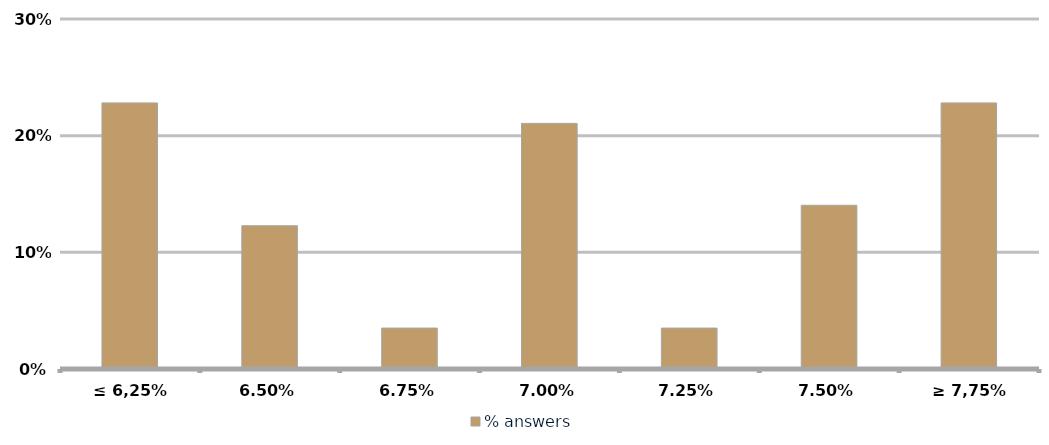
| Category | % answers |
|---|---|
| ≤ 6,25% | 0.228 |
| 6,50% | 0.123 |
| 6,75% | 0.035 |
| 7,00% | 0.211 |
| 7,25% | 0.035 |
| 7,50% | 0.14 |
| ≥ 7,75% | 0.228 |